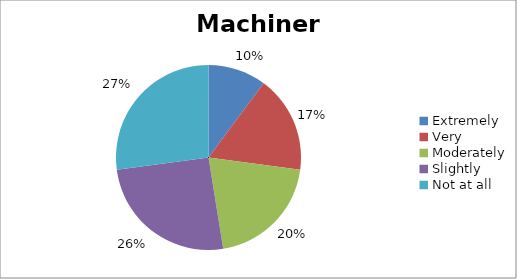
| Category | Machinery |
|---|---|
| Extremely | 6 |
| Very | 10 |
| Moderately | 12 |
| Slightly | 15 |
| Not at all | 16 |